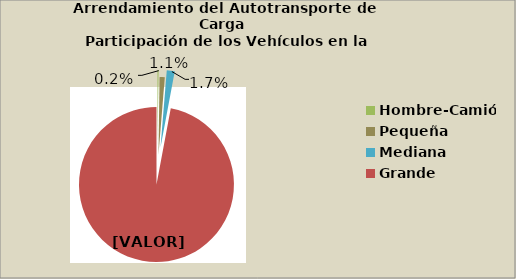
| Category | Series 0 |
|---|---|
| Hombre-Camión | 0.216 |
| Pequeña | 1.075 |
| Mediana | 1.656 |
| Grande | 97 |